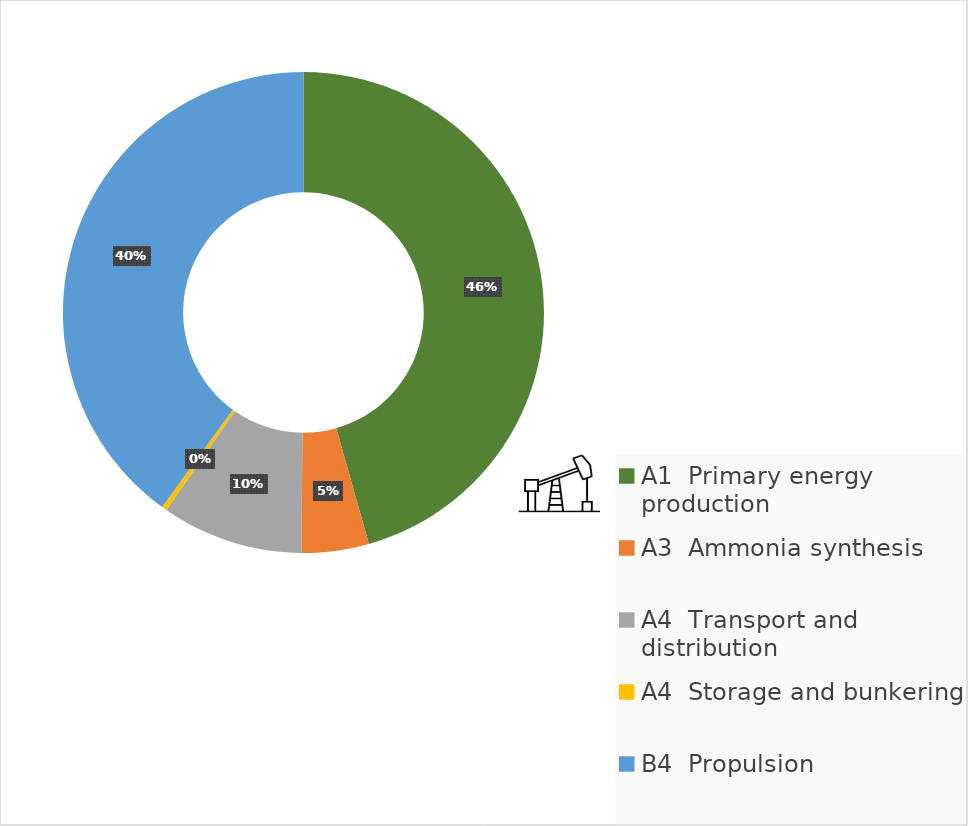
| Category | Series 0 |
|---|---|
| A1  Primary energy production | 34.759 |
| A3  Ammonia synthesis | 3.448 |
| A4  Transport and distribution | 7.254 |
| A4  Storage and bunkering | 0.261 |
| B4  Propulsion  | 30.481 |